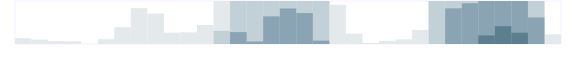
| Category | ИТ | Series 1 | Series 2 | Series 3 |
|---|---|---|---|---|
| 0.333333333333333 | 100 | 0 | 0 | 0 |
| nan | 78 | 0 | 0 | 0 |
| nan | 51 | 0 | 0 | 0 |
| nan | 48 | 0 | 0 | 0 |
| 0.416666666666667 | 2 | 0 | 0 | 0 |
| nan | 84 | 0 | 0 | 0 |
| nan | 292 | 0 | 0 | 0 |
| nan | 625 | 0 | 0 | 0 |
| 0.5 | 531 | 0 | 0 | 0 |
| nan | 198 | 0 | 0 | 0 |
| nan | 203 | 0 | 0 | 0 |
| nan | 332 | 0 | 0 | 0 |
| 0.583333333333333 | 750 | 229 | 0 | 0 |
| nan | 750 | 750 | 208 | 0 |
| nan | 750 | 750 | 43 | 0 |
| nan | 750 | 750 | 482 | 0 |
| 0.666666666666667 | 750 | 750 | 620 | 0 |
| nan | 750 | 750 | 540 | 0 |
| nan | 750 | 750 | 59 | 0 |
| nan | 683 | 0 | 0 | 0 |
| 0.75 | 180 | 0 | 0 | 0 |
| nan | 17 | 0 | 0 | 0 |
| nan | 55 | 0 | 0 | 0 |
| nan | 79 | 0 | 0 | 0 |
| 0.833333333333333 | 246 | 0 | 0 | 0 |
| nan | 750 | 749 | 0 | 0 |
| nan | 750 | 750 | 622 | 0 |
| nan | 750 | 750 | 711 | 0 |
| 0.916666666666667 | 750 | 750 | 750 | 150 |
| nan | 750 | 750 | 750 | 311 |
| nan | 750 | 750 | 750 | 197 |
| nan | 750 | 750 | 463 | 0 |
| 0.9993055555555556 | 170 | 0 | 0 | 0 |